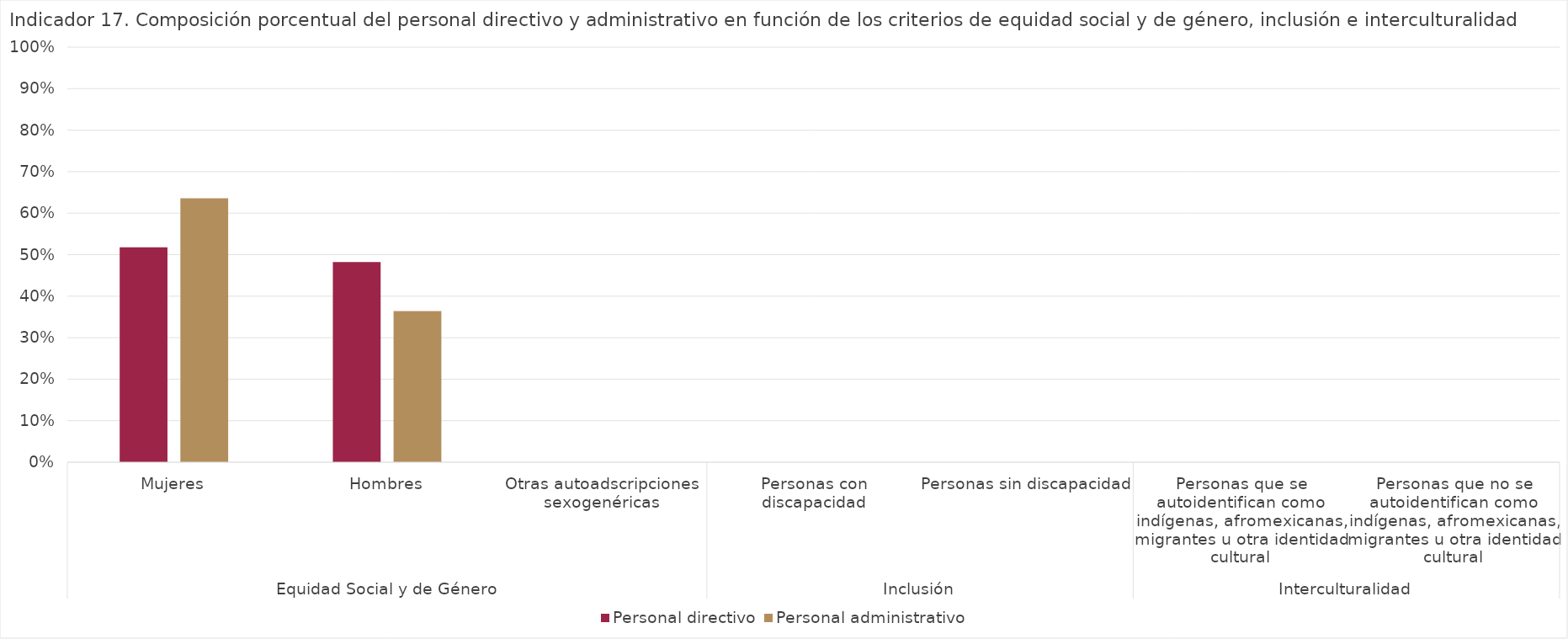
| Category | Personal directivo | Personal administrativo |
|---|---|---|
| 0 | 0.518 | 0.636 |
| 1 | 0.482 | 0.364 |
| 2 | 0 | 0 |
| 3 | 0 | 0 |
| 4 | 0 | 0 |
| 5 | 0 | 0 |
| 6 | 0 | 0 |